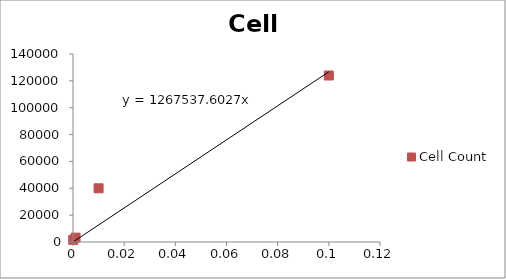
| Category | Cell Count |
|---|---|
| 0.1 | 124000 |
| 0.01 | 40000 |
| 0.001 | 3250 |
| 0.0001 | 1600 |